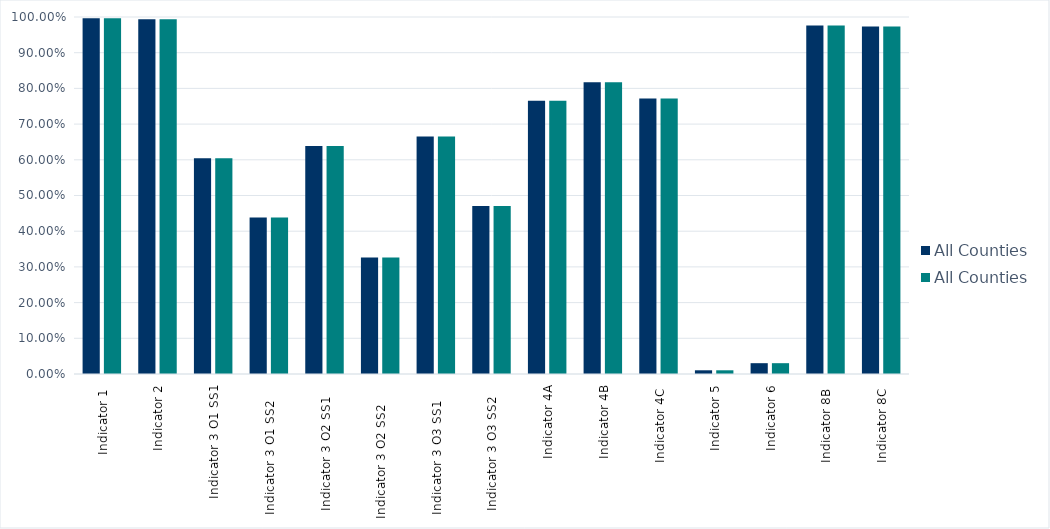
| Category | All Counties |
|---|---|
| Indicator 1  | 0.996 |
| Indicator 2 | 0.994 |
| Indicator 3 O1 SS1 | 0.604 |
| Indicator 3 O1 SS2     | 0.438 |
| Indicator 3 O2 SS1    | 0.638 |
| Indicator 3 O2 SS2      | 0.326 |
| Indicator 3 O3 SS1     | 0.665 |
| Indicator 3 O3 SS2    | 0.47 |
| Indicator 4A | 0.766 |
| Indicator 4B | 0.817 |
| Indicator 4C  | 0.771 |
| Indicator 5 | 0.01 |
| Indicator 6 | 0.03 |
| Indicator 8B  | 0.976 |
| Indicator 8C  | 0.973 |